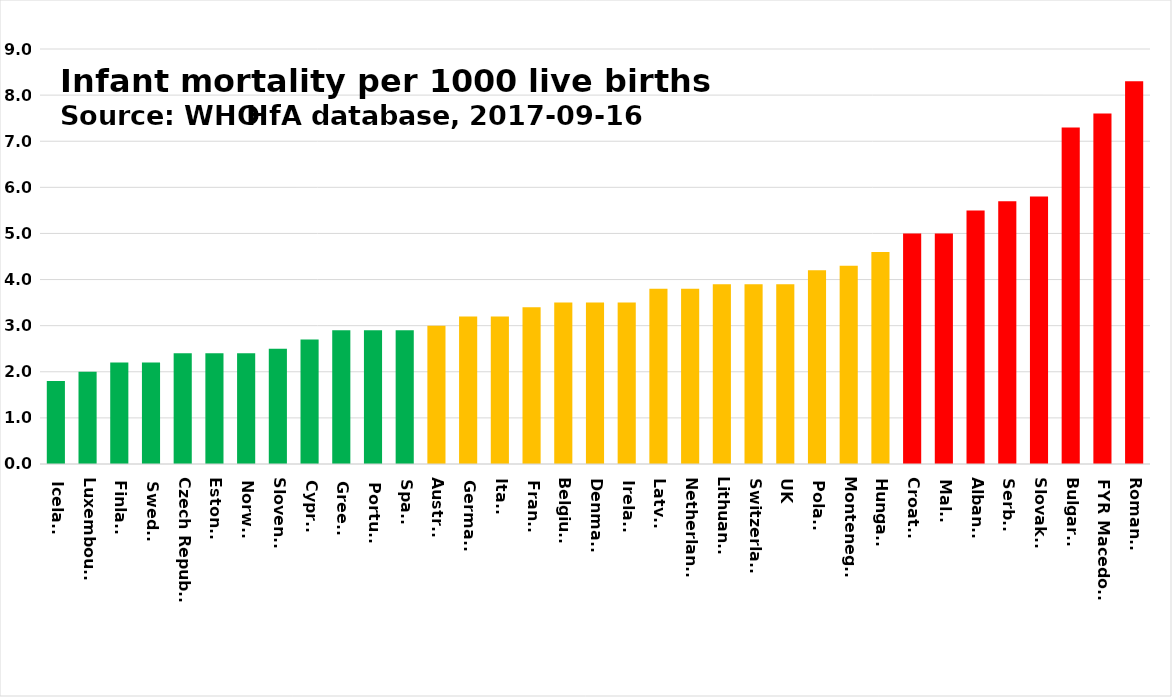
| Category | Series 0 |
|---|---|
| Iceland | 1.8 |
| Luxembourg | 2 |
| Finland | 2.2 |
| Sweden | 2.2 |
| Czech Republic | 2.4 |
| Estonia | 2.4 |
| Norway | 2.4 |
| Slovenia | 2.5 |
| Cyprus | 2.7 |
| Greece | 2.9 |
| Portugal | 2.9 |
| Spain | 2.9 |
| Austria | 3 |
| Germany | 3.2 |
| Italy | 3.2 |
| France | 3.4 |
| Belgium | 3.5 |
| Denmark | 3.5 |
| Ireland | 3.5 |
| Latvia | 3.8 |
| Netherlands | 3.8 |
| Lithuania | 3.9 |
| Switzerland | 3.9 |
| UK | 3.9 |
| Poland | 4.2 |
| Montenegro | 4.3 |
| Hungary | 4.6 |
| Croatia | 5 |
| Malta | 5 |
| Albania | 5.5 |
| Serbia | 5.7 |
| Slovakia | 5.8 |
| Bulgaria | 7.3 |
| FYR Macedonia | 7.6 |
| Romania | 8.3 |